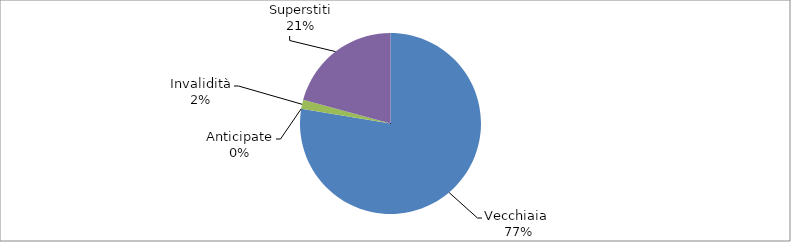
| Category | Series 0 |
|---|---|
| Vecchiaia  | 23550 |
| Anticipate | 0 |
| Invalidità | 492 |
| Superstiti | 6308 |